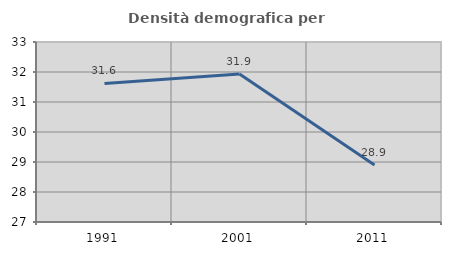
| Category | Densità demografica |
|---|---|
| 1991.0 | 31.619 |
| 2001.0 | 31.93 |
| 2011.0 | 28.903 |